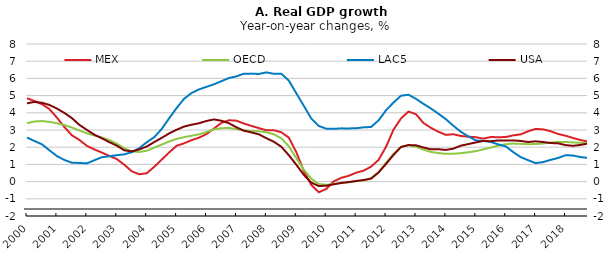
| Category | MEX | OECD | LAC5 | USA |
|---|---|---|---|---|
| 2000.0 | 4.847 | 3.396 | 2.565 | 4.551 |
| 2000.0 | 4.684 | 3.494 | 2.358 | 4.633 |
| 2000.0 | 4.501 | 3.519 | 2.167 | 4.583 |
| 2000.0 | 4.217 | 3.473 | 1.82 | 4.457 |
| 2001.0 | 3.717 | 3.391 | 1.484 | 4.245 |
| 2001.0 | 3.171 | 3.286 | 1.258 | 3.992 |
| 2001.0 | 2.693 | 3.141 | 1.098 | 3.692 |
| 2001.0 | 2.422 | 2.97 | 1.085 | 3.299 |
| 2002.0 | 2.08 | 2.812 | 1.059 | 3.006 |
| 2002.0 | 1.872 | 2.679 | 1.241 | 2.73 |
| 2002.0 | 1.688 | 2.564 | 1.418 | 2.521 |
| 2002.0 | 1.495 | 2.416 | 1.473 | 2.295 |
| 2003.0 | 1.312 | 2.207 | 1.534 | 2.092 |
| 2003.0 | 0.985 | 1.932 | 1.585 | 1.82 |
| 2003.0 | 0.601 | 1.762 | 1.71 | 1.755 |
| 2003.0 | 0.427 | 1.723 | 1.94 | 1.868 |
| 2004.0 | 0.484 | 1.793 | 2.284 | 2.034 |
| 2004.0 | 0.853 | 1.969 | 2.577 | 2.297 |
| 2004.0 | 1.274 | 2.153 | 3.056 | 2.541 |
| 2004.0 | 1.694 | 2.335 | 3.678 | 2.801 |
| 2005.0 | 2.08 | 2.482 | 4.275 | 3.014 |
| 2005.0 | 2.227 | 2.585 | 4.817 | 3.199 |
| 2005.0 | 2.41 | 2.666 | 5.151 | 3.307 |
| 2005.0 | 2.556 | 2.749 | 5.36 | 3.393 |
| 2006.0 | 2.764 | 2.887 | 5.51 | 3.525 |
| 2006.0 | 3.088 | 3.043 | 5.658 | 3.615 |
| 2006.0 | 3.417 | 3.104 | 5.841 | 3.538 |
| 2006.0 | 3.567 | 3.117 | 6.022 | 3.393 |
| 2007.0 | 3.543 | 3.056 | 6.118 | 3.158 |
| 2007.0 | 3.373 | 2.975 | 6.276 | 2.96 |
| 2007.0 | 3.241 | 2.942 | 6.278 | 2.859 |
| 2007.0 | 3.108 | 2.927 | 6.258 | 2.75 |
| 2008.0 | 2.983 | 2.866 | 6.351 | 2.523 |
| 2008.0 | 2.985 | 2.75 | 6.268 | 2.317 |
| 2008.0 | 2.87 | 2.518 | 6.269 | 2.025 |
| 2008.0 | 2.557 | 2.053 | 5.875 | 1.535 |
| 2009.0 | 1.713 | 1.369 | 5.135 | 0.982 |
| 2009.0 | 0.621 | 0.699 | 4.413 | 0.395 |
| 2009.0 | -0.192 | 0.169 | 3.671 | -0.057 |
| 2009.0 | -0.62 | -0.141 | 3.235 | -0.257 |
| 2010.0 | -0.428 | -0.184 | 3.077 | -0.238 |
| 2010.0 | 0.011 | -0.14 | 3.066 | -0.157 |
| 2010.0 | 0.22 | -0.082 | 3.095 | -0.078 |
| 2010.0 | 0.335 | -0.039 | 3.092 | -0.028 |
| 2011.0 | 0.516 | 0.021 | 3.1 | 0.037 |
| 2011.0 | 0.636 | 0.081 | 3.157 | 0.09 |
| 2011.0 | 0.87 | 0.206 | 3.174 | 0.168 |
| 2011.0 | 1.261 | 0.543 | 3.562 | 0.532 |
| 2012.0 | 2.026 | 1.095 | 4.145 | 1.027 |
| 2012.0 | 3.018 | 1.613 | 4.596 | 1.551 |
| 2012.0 | 3.673 | 2.005 | 4.993 | 2.016 |
| 2012.0 | 4.072 | 2.129 | 5.05 | 2.123 |
| 2013.0 | 3.921 | 2.021 | 4.811 | 2.111 |
| 2013.0 | 3.408 | 1.861 | 4.519 | 1.983 |
| 2013.0 | 3.126 | 1.725 | 4.25 | 1.878 |
| 2013.0 | 2.897 | 1.66 | 3.947 | 1.882 |
| 2014.0 | 2.716 | 1.612 | 3.629 | 1.843 |
| 2014.0 | 2.753 | 1.618 | 3.249 | 1.916 |
| 2014.0 | 2.653 | 1.654 | 2.897 | 2.09 |
| 2014.0 | 2.611 | 1.705 | 2.628 | 2.181 |
| 2015.0 | 2.582 | 1.771 | 2.392 | 2.278 |
| 2015.0 | 2.496 | 1.871 | 2.362 | 2.361 |
| 2015.0 | 2.592 | 1.976 | 2.307 | 2.349 |
| 2015.0 | 2.58 | 2.092 | 2.161 | 2.393 |
| 2016.0 | 2.591 | 2.173 | 2.05 | 2.392 |
| 2016.0 | 2.687 | 2.212 | 1.717 | 2.395 |
| 2016.0 | 2.745 | 2.193 | 1.426 | 2.363 |
| 2016.0 | 2.925 | 2.175 | 1.244 | 2.302 |
| 2017.0 | 3.066 | 2.183 | 1.074 | 2.342 |
| 2017.0 | 3.035 | 2.215 | 1.136 | 2.301 |
| 2017.0 | 2.928 | 2.271 | 1.264 | 2.243 |
| 2017.0 | 2.77 | 2.309 | 1.373 | 2.224 |
| 2018.0 | 2.668 | 2.303 | 1.535 | 2.122 |
| 2018.0 | 2.536 | 2.278 | 1.516 | 2.08 |
| 2018.0 | 2.417 | 2.254 | 1.425 | 2.132 |
| 2018.0 | 2.327 | 2.225 | 1.373 | 2.213 |